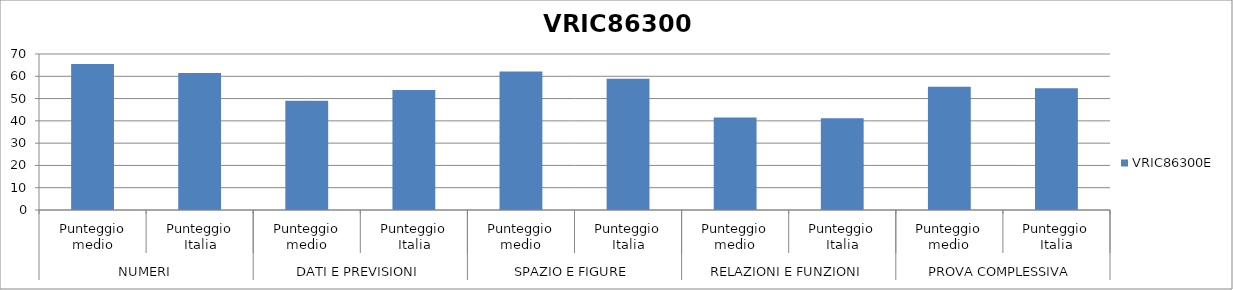
| Category | VRIC86300E |
|---|---|
| 0 | 65.5 |
| 1 | 61.5 |
| 2 | 49 |
| 3 | 53.9 |
| 4 | 62.2 |
| 5 | 58.9 |
| 6 | 41.5 |
| 7 | 41.2 |
| 8 | 55.3 |
| 9 | 54.6 |